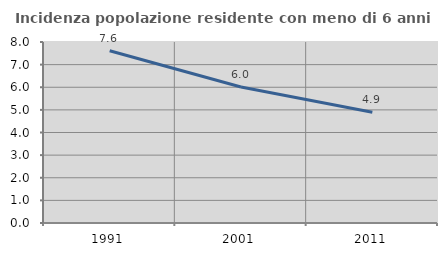
| Category | Incidenza popolazione residente con meno di 6 anni |
|---|---|
| 1991.0 | 7.616 |
| 2001.0 | 6.012 |
| 2011.0 | 4.896 |